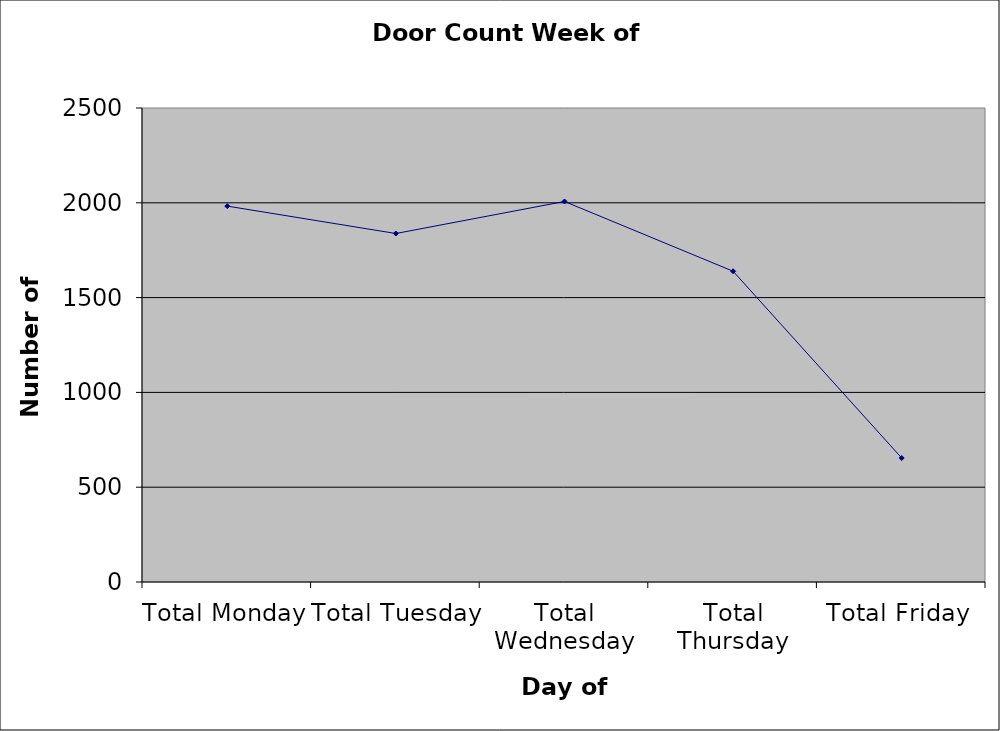
| Category | Series 0 |
|---|---|
| Total Monday | 1982.5 |
| Total Tuesday | 1838 |
| Total Wednesday | 2007 |
| Total Thursday | 1639 |
| Total Friday | 654 |